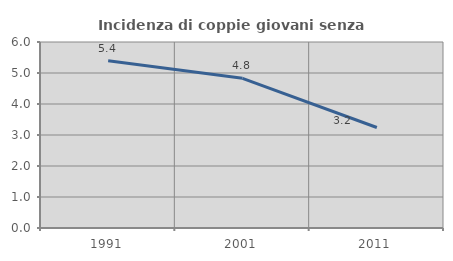
| Category | Incidenza di coppie giovani senza figli |
|---|---|
| 1991.0 | 5.393 |
| 2001.0 | 4.829 |
| 2011.0 | 3.241 |